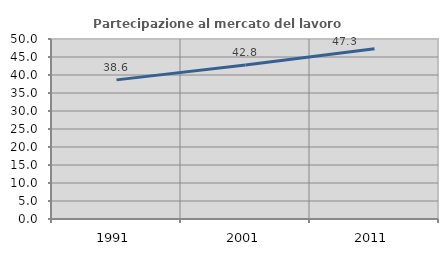
| Category | Partecipazione al mercato del lavoro  femminile |
|---|---|
| 1991.0 | 38.646 |
| 2001.0 | 42.764 |
| 2011.0 | 47.309 |